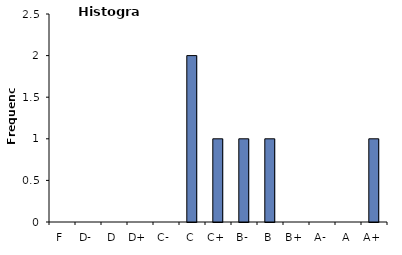
| Category | Grade |
|---|---|
| F | 0 |
| D- | 0 |
| D | 0 |
| D+ | 0 |
| C- | 0 |
| C | 2 |
| C+ | 1 |
| B- | 1 |
| B | 1 |
| B+ | 0 |
| A- | 0 |
| A | 0 |
| A+ | 1 |